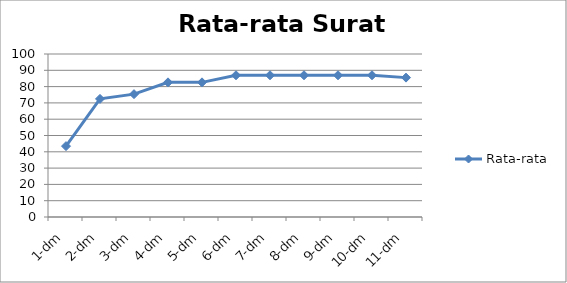
| Category | Rata-rata |
|---|---|
| 1-dm | 43.478 |
| 2-dm | 72.464 |
| 3-dm | 75.362 |
| 4-dm | 82.609 |
| 5-dm | 82.609 |
| 6-dm | 86.957 |
| 7-dm | 86.957 |
| 8-dm | 86.957 |
| 9-dm | 86.957 |
| 10-dm | 86.957 |
| 11-dm | 85.507 |